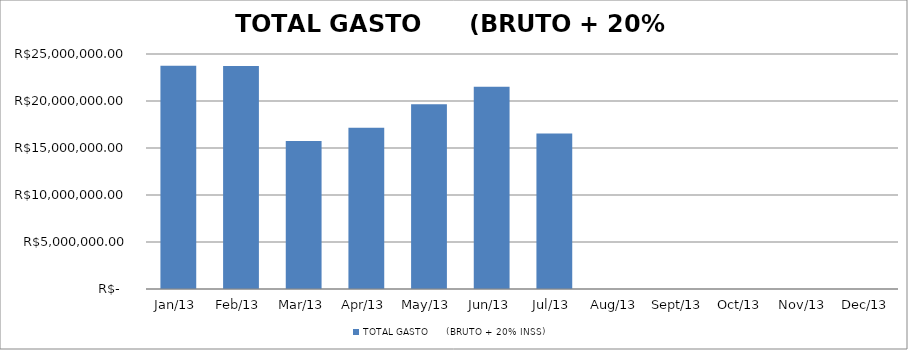
| Category | TOTAL GASTO      (BRUTO + 20% INSS) |
|---|---|
| 2013-01-01 | 23753127.04 |
| 2013-02-01 | 23729691.57 |
| 2013-03-01 | 15731767.78 |
| 2013-04-01 | 17150642.43 |
| 2013-05-01 | 19650299.26 |
| 2013-06-01 | 21508349.86 |
| 2013-07-01 | 16553673.91 |
| 2013-08-01 | 0 |
| 2013-09-01 | 0 |
| 2013-10-01 | 0 |
| 2013-11-01 | 0 |
| 2013-12-01 | 0 |